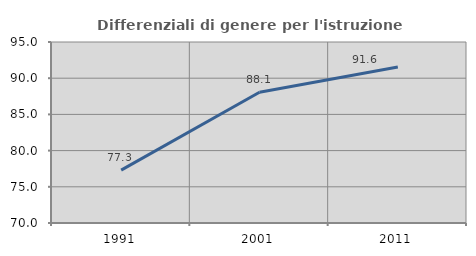
| Category | Differenziali di genere per l'istruzione superiore |
|---|---|
| 1991.0 | 77.303 |
| 2001.0 | 88.062 |
| 2011.0 | 91.555 |